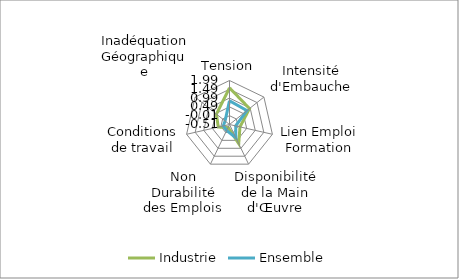
| Category | Industrie | Ensemble |
|---|---|---|
| Tension | 1.573 | 0.838 |
| Intensité d'Embauche | 0.944 | 0.756 |
| Lien Emploi Formation | 0.101 | -0.154 |
| Disponibilité de la Main d'Œuvre | 0.696 | 0.329 |
| Non Durabilité des Emplois | -0.327 | -0.133 |
| Conditions de travail | 0.146 | -0.146 |
| Inadéquation Géographique | 0.438 | -0.188 |